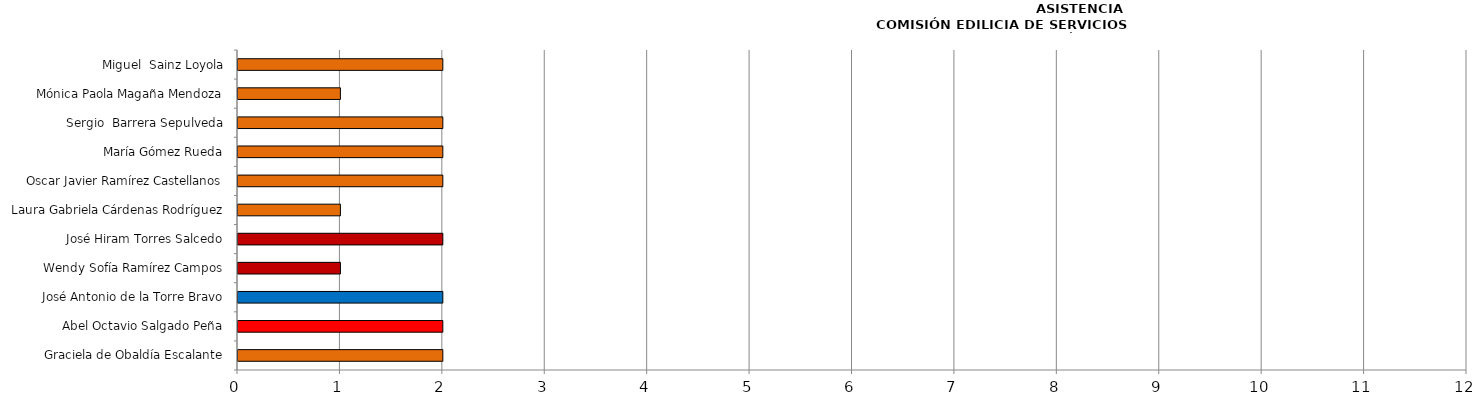
| Category | Series 0 |
|---|---|
| Graciela de Obaldía Escalante | 2 |
| Abel Octavio Salgado Peña | 2 |
| José Antonio de la Torre Bravo | 2 |
| Wendy Sofía Ramírez Campos | 1 |
| José Hiram Torres Salcedo | 2 |
| Laura Gabriela Cárdenas Rodríguez | 1 |
| Oscar Javier Ramírez Castellanos | 2 |
| María Gómez Rueda | 2 |
| Sergio  Barrera Sepulveda | 2 |
| Mónica Paola Magaña Mendoza | 1 |
| Miguel  Sainz Loyola | 2 |